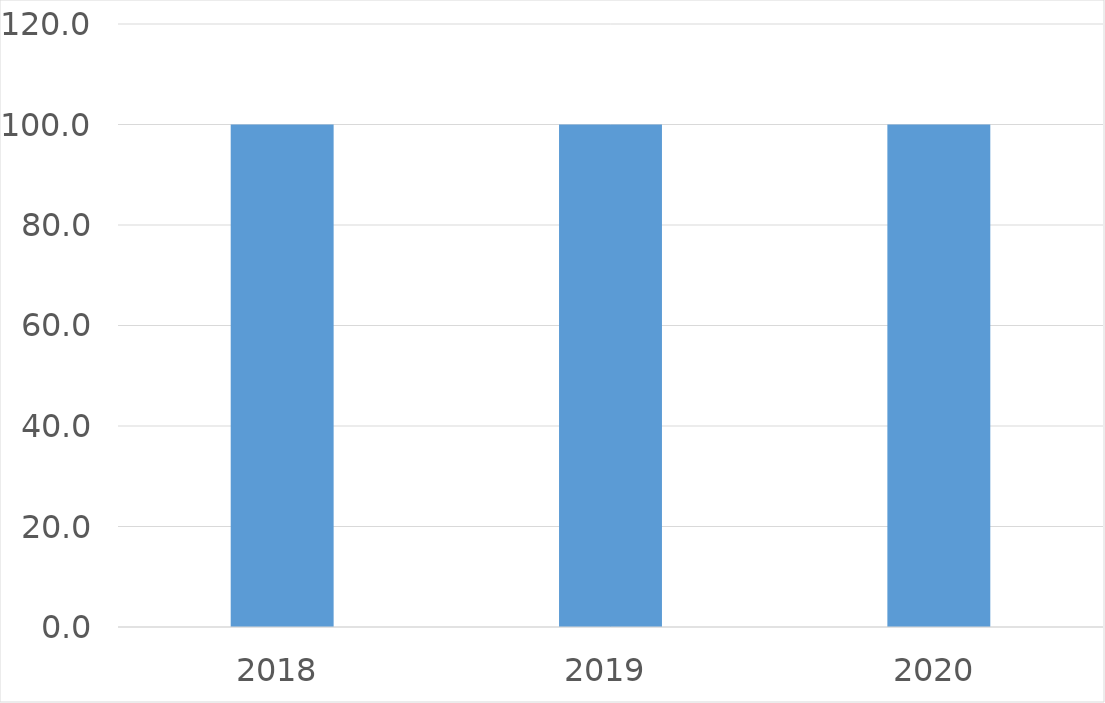
| Category | Series 0 |
|---|---|
| 2018 | 100 |
| 2019 | 100 |
| 2020 | 100 |